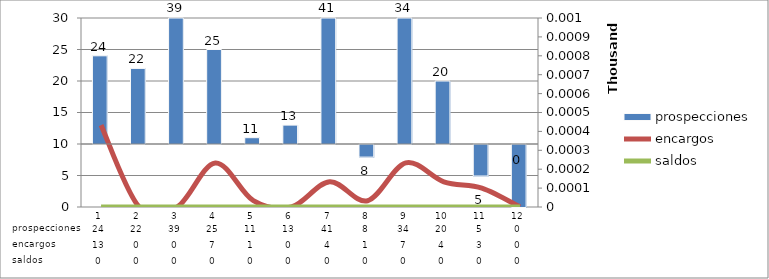
| Category | prospecciones |
|---|---|
| 0 | 24 |
| 1 | 22 |
| 2 | 39 |
| 3 | 25 |
| 4 | 11 |
| 5 | 13 |
| 6 | 41 |
| 7 | 8 |
| 8 | 34 |
| 9 | 20 |
| 10 | 5 |
| 11 | 0 |